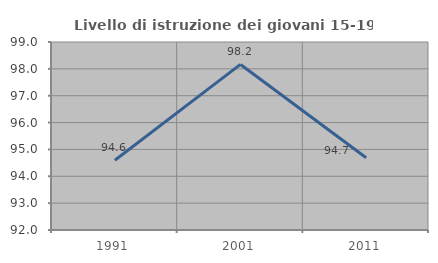
| Category | Livello di istruzione dei giovani 15-19 anni |
|---|---|
| 1991.0 | 94.595 |
| 2001.0 | 98.165 |
| 2011.0 | 94.69 |